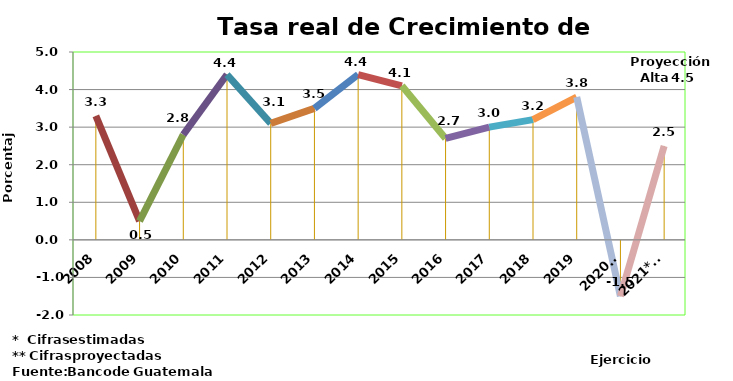
| Category | Series 0 |
|---|---|
| 2008 | 3.3 |
| 2009 | 0.5 |
| 2010 | 2.8 |
| 2011 | 4.4 |
| 2012 | 3.1 |
| 2013 | 3.5 |
| 2014 | 4.4 |
| 2015 | 4.1 |
| 2016 | 2.7 |
| 2017 | 3 |
| 2018 | 3.2 |
| 2019 | 3.8 |
| 2020 * | -1.5 |
| 2021**  | 2.5 |